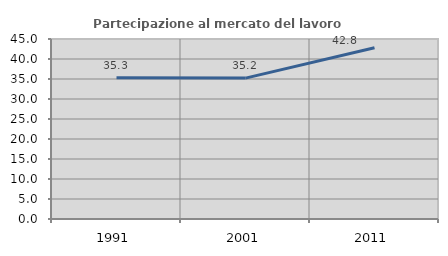
| Category | Partecipazione al mercato del lavoro  femminile |
|---|---|
| 1991.0 | 35.322 |
| 2001.0 | 35.229 |
| 2011.0 | 42.833 |